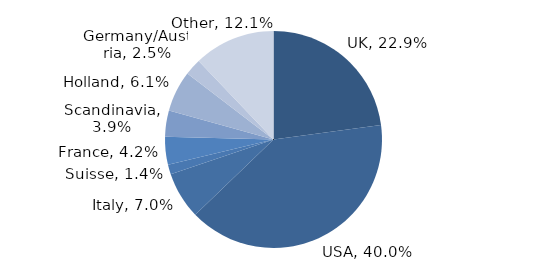
| Category | Investment Style |
|---|---|
| UK | 0.229 |
| USA | 0.4 |
| Italy | 0.07 |
| Suisse | 0.014 |
| France | 0.042 |
| Scandinavia | 0.039 |
| Holland | 0.061 |
| Germany/Austria | 0.025 |
| Other | 0.121 |